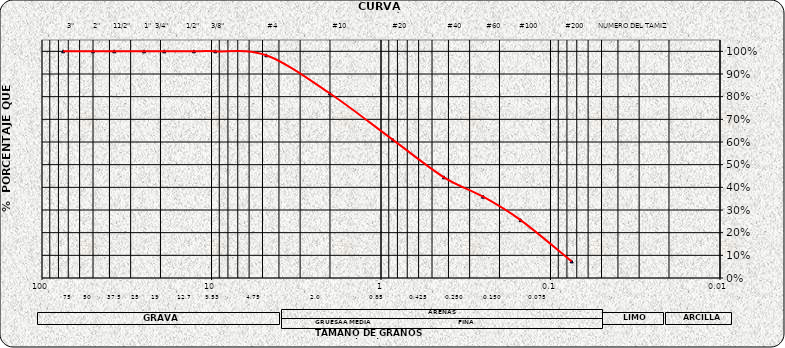
| Category | Series 0 |
|---|---|
| 75.0 | 1 |
| 50.0 | 1 |
| 37.5 | 1 |
| 25.0 | 1 |
| 19.0 | 1 |
| 12.7 | 1 |
| 9.5 | 1 |
| 4.75 | 0.983 |
| 2.0 | 0.814 |
| 0.85 | 0.609 |
| 0.425 | 0.444 |
| 0.25 | 0.359 |
| 0.15 | 0.255 |
| 0.075 | 0.073 |
| nan | 0 |